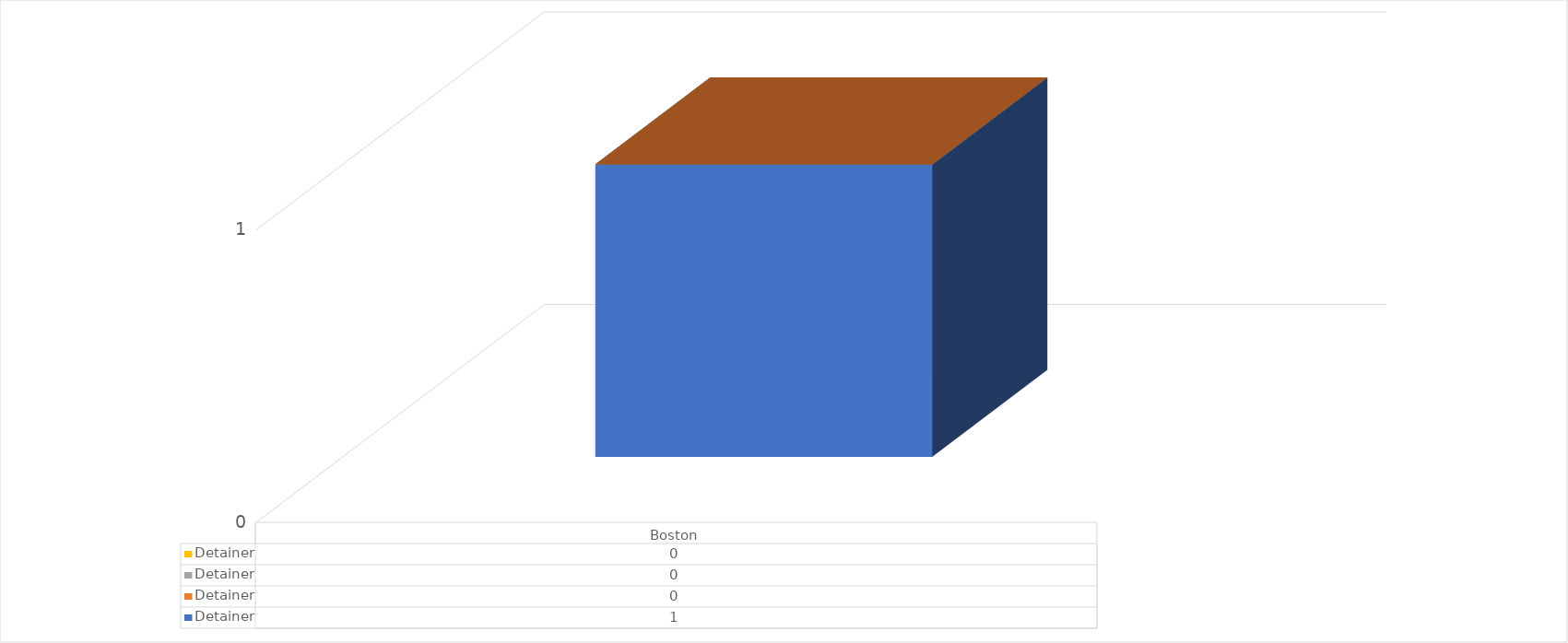
| Category | Sum of Other Priority - Detainer | Sum of Public Safety - Detainer | Sum of Border Security - Detainer | Sum of National Security - Detainer |
|---|---|---|---|---|
| Boston | 1 | 0 | 0 | 0 |